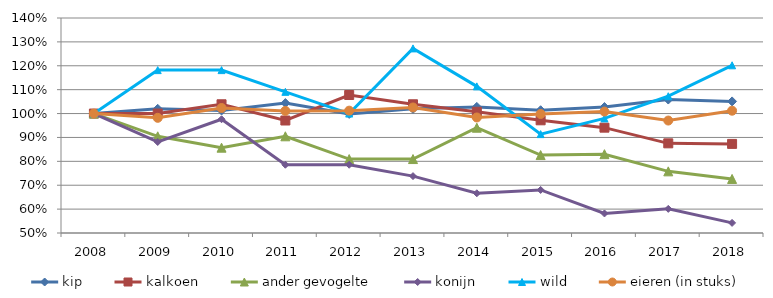
| Category | kip | kalkoen | ander gevogelte | konijn | wild | eieren (in stuks) |
|---|---|---|---|---|---|---|
| 2008.0 | 100 | 100 | 100 | 100 | 100 | 100 |
| 2009.0 | 101.98 | 100 | 90.476 | 88.095 | 118.182 | 98.215 |
| 2010.0 | 101.273 | 103.883 | 85.714 | 97.619 | 118.182 | 102.324 |
| 2011.0 | 104.385 | 97.087 | 90.476 | 78.571 | 109.091 | 101.108 |
| 2012.0 | 99.859 | 107.767 | 80.952 | 78.571 | 100 | 101.216 |
| 2013.0 | 101.98 | 103.883 | 80.952 | 73.81 | 127.273 | 102.539 |
| 2014.0 | 102.778 | 100.757 | 94.076 | 66.63 | 111.384 | 98.361 |
| 2015.0 | 101.395 | 97.176 | 82.621 | 68.029 | 91.395 | 99.823 |
| 2016.0 | 102.726 | 94.097 | 82.995 | 58.181 | 97.964 | 100.83 |
| 2017.0 | 105.867 | 87.532 | 75.809 | 60.103 | 107.256 | 97.073 |
| 2018.0 | 105.085 | 87.298 | 72.628 | 54.228 | 120.2 | 101.195 |